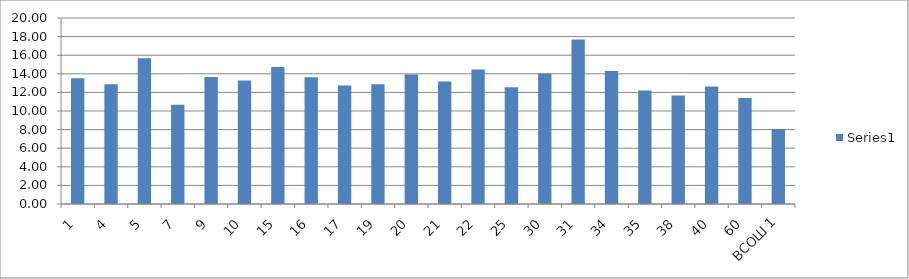
| Category | Series 0 |
|---|---|
| 1 | 13.514 |
| 4 | 12.875 |
| 5 | 15.667 |
| 7 | 10.667 |
| 9 | 13.652 |
| 10 | 13.277 |
| 15 | 14.737 |
| 16 | 13.621 |
| 17 | 12.743 |
| 19 | 12.885 |
| 20 | 13.913 |
| 21 | 13.16 |
| 22 | 14.458 |
| 25 | 12.565 |
| 30 | 14.045 |
| 31 | 17.684 |
| 34 | 14.31 |
| 35 | 12.217 |
| 38 | 11.667 |
| 40 | 12.647 |
| 60 | 11.391 |
| ВСОШ 1 | 8.053 |